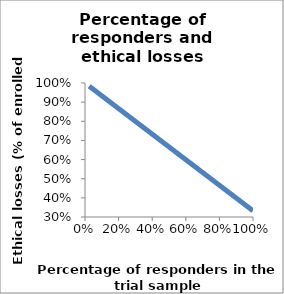
| Category | ethical losses in % of enrolled patients |
|---|---|
| 1.0 | 0.332 |
| 0.975 | 0.349 |
| 0.95 | 0.366 |
| 0.9249999999999999 | 0.382 |
| 0.8999999999999999 | 0.399 |
| 0.8749999999999999 | 0.416 |
| 0.8499999999999999 | 0.432 |
| 0.8249999999999998 | 0.449 |
| 0.7999999999999998 | 0.466 |
| 0.7749999999999998 | 0.483 |
| 0.7499999999999998 | 0.499 |
| 0.7249999999999998 | 0.516 |
| 0.6999999999999997 | 0.533 |
| 0.6749999999999997 | 0.549 |
| 0.6499999999999997 | 0.566 |
| 0.6249999999999997 | 0.583 |
| 0.5999999999999996 | 0.599 |
| 0.5749999999999996 | 0.616 |
| 0.5499999999999996 | 0.633 |
| 0.5249999999999996 | 0.649 |
| 0.49999999999999956 | 0.666 |
| 0.47499999999999953 | 0.683 |
| 0.4499999999999995 | 0.7 |
| 0.4249999999999995 | 0.716 |
| 0.39999999999999947 | 0.733 |
| 0.37499999999999944 | 0.75 |
| 0.3499999999999994 | 0.766 |
| 0.3249999999999994 | 0.783 |
| 0.2999999999999994 | 0.8 |
| 0.27499999999999936 | 0.816 |
| 0.24999999999999936 | 0.833 |
| 0.22499999999999937 | 0.85 |
| 0.19999999999999937 | 0.866 |
| 0.17499999999999938 | 0.883 |
| 0.14999999999999938 | 0.9 |
| 0.12499999999999939 | 0.917 |
| 0.0999999999999994 | 0.933 |
| 0.0749999999999994 | 0.95 |
| 0.0499999999999994 | 0.967 |
| 0.024999999999999398 | 0.983 |